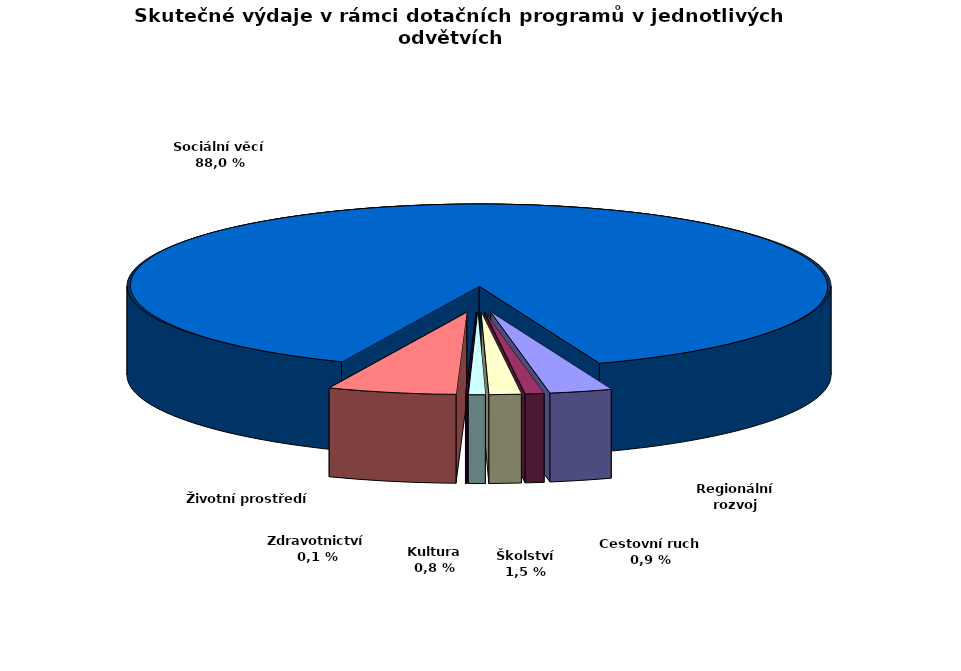
| Category | Series 0 |
|---|---|
| Regionální rozvoj | 35069.634 |
| Cestovní ruch | 10618.732 |
| Školství | 17998.253 |
| Kultura | 9423.049 |
| Zdravotnictví | 812.8 |
| Životní prostředí  | 72239.372 |
| Sociální věcí | 1077565.003 |